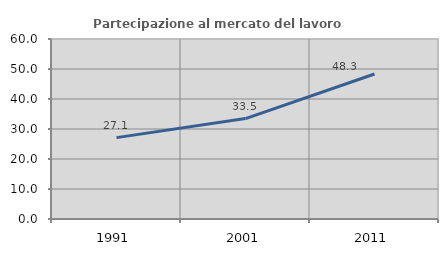
| Category | Partecipazione al mercato del lavoro  femminile |
|---|---|
| 1991.0 | 27.126 |
| 2001.0 | 33.482 |
| 2011.0 | 48.347 |